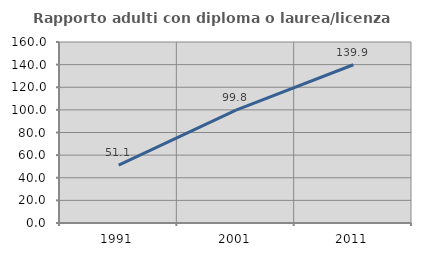
| Category | Rapporto adulti con diploma o laurea/licenza media  |
|---|---|
| 1991.0 | 51.111 |
| 2001.0 | 99.843 |
| 2011.0 | 139.903 |